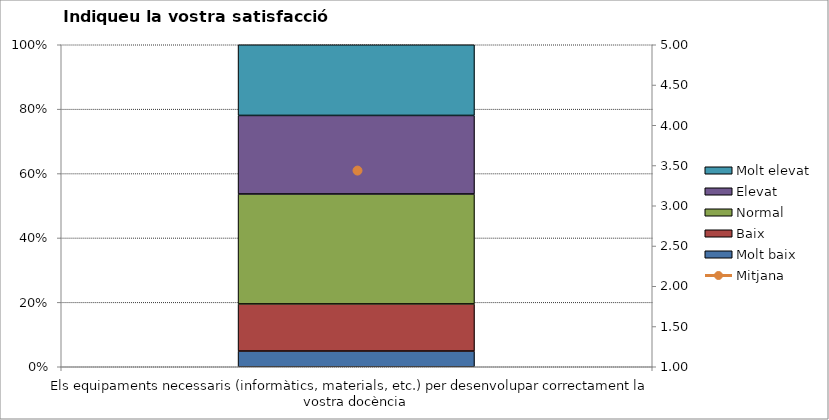
| Category | Molt baix | Baix | Normal  | Elevat | Molt elevat |
|---|---|---|---|---|---|
| Els equipaments necessaris (informàtics, materials, etc.) per desenvolupar correctament la vostra docència | 2 | 6 | 14 | 10 | 9 |